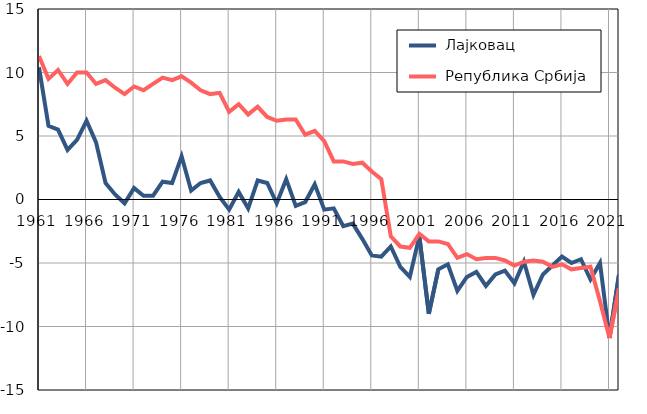
| Category |  Лајковац |  Република Србија |
|---|---|---|
| 1961.0 | 10.4 | 11.3 |
| 1962.0 | 5.8 | 9.5 |
| 1963.0 | 5.5 | 10.2 |
| 1964.0 | 3.9 | 9.1 |
| 1965.0 | 4.7 | 10 |
| 1966.0 | 6.2 | 10 |
| 1967.0 | 4.5 | 9.1 |
| 1968.0 | 1.3 | 9.4 |
| 1969.0 | 0.4 | 8.8 |
| 1970.0 | -0.3 | 8.3 |
| 1971.0 | 0.9 | 8.9 |
| 1972.0 | 0.3 | 8.6 |
| 1973.0 | 0.3 | 9.1 |
| 1974.0 | 1.4 | 9.6 |
| 1975.0 | 1.3 | 9.4 |
| 1976.0 | 3.4 | 9.7 |
| 1977.0 | 0.7 | 9.2 |
| 1978.0 | 1.3 | 8.6 |
| 1979.0 | 1.5 | 8.3 |
| 1980.0 | 0.2 | 8.4 |
| 1981.0 | -0.8 | 6.9 |
| 1982.0 | 0.6 | 7.5 |
| 1983.0 | -0.7 | 6.7 |
| 1984.0 | 1.5 | 7.3 |
| 1985.0 | 1.3 | 6.5 |
| 1986.0 | -0.3 | 6.2 |
| 1987.0 | 1.6 | 6.3 |
| 1988.0 | -0.5 | 6.3 |
| 1989.0 | -0.2 | 5.1 |
| 1990.0 | 1.2 | 5.4 |
| 1991.0 | -0.8 | 4.6 |
| 1992.0 | -0.7 | 3 |
| 1993.0 | -2.1 | 3 |
| 1994.0 | -1.9 | 2.8 |
| 1995.0 | -3.1 | 2.9 |
| 1996.0 | -4.4 | 2.2 |
| 1997.0 | -4.5 | 1.6 |
| 1998.0 | -3.7 | -2.9 |
| 1999.0 | -5.3 | -3.7 |
| 2000.0 | -6.1 | -3.8 |
| 2001.0 | -2.9 | -2.7 |
| 2002.0 | -9 | -3.3 |
| 2003.0 | -5.5 | -3.3 |
| 2004.0 | -5.1 | -3.5 |
| 2005.0 | -7.2 | -4.6 |
| 2006.0 | -6.1 | -4.3 |
| 2007.0 | -5.7 | -4.7 |
| 2008.0 | -6.8 | -4.6 |
| 2009.0 | -5.9 | -4.6 |
| 2010.0 | -5.6 | -4.8 |
| 2011.0 | -6.6 | -5.2 |
| 2012.0 | -4.9 | -4.9 |
| 2013.0 | -7.5 | -4.8 |
| 2014.0 | -5.9 | -4.9 |
| 2015.0 | -5.2 | -5.3 |
| 2016.0 | -4.5 | -5.1 |
| 2017.0 | -5 | -5.5 |
| 2018.0 | -4.7 | -5.4 |
| 2019.0 | -6.3 | -5.3 |
| 2020.0 | -5 | -8 |
| 2021.0 | -10.9 | -10.9 |
| 2022.0 | -5.9 | -7 |